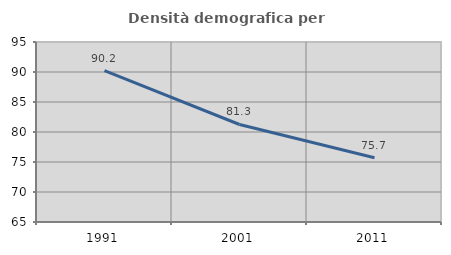
| Category | Densità demografica |
|---|---|
| 1991.0 | 90.23 |
| 2001.0 | 81.252 |
| 2011.0 | 75.709 |